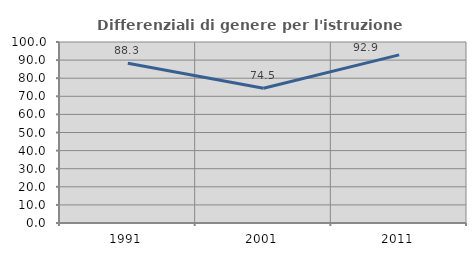
| Category | Differenziali di genere per l'istruzione superiore |
|---|---|
| 1991.0 | 88.267 |
| 2001.0 | 74.462 |
| 2011.0 | 92.872 |